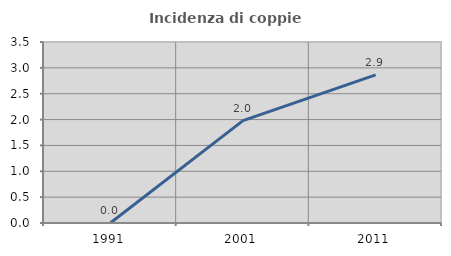
| Category | Incidenza di coppie miste |
|---|---|
| 1991.0 | 0 |
| 2001.0 | 1.98 |
| 2011.0 | 2.864 |